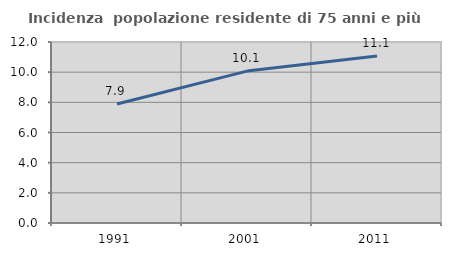
| Category | Incidenza  popolazione residente di 75 anni e più |
|---|---|
| 1991.0 | 7.886 |
| 2001.0 | 10.07 |
| 2011.0 | 11.067 |